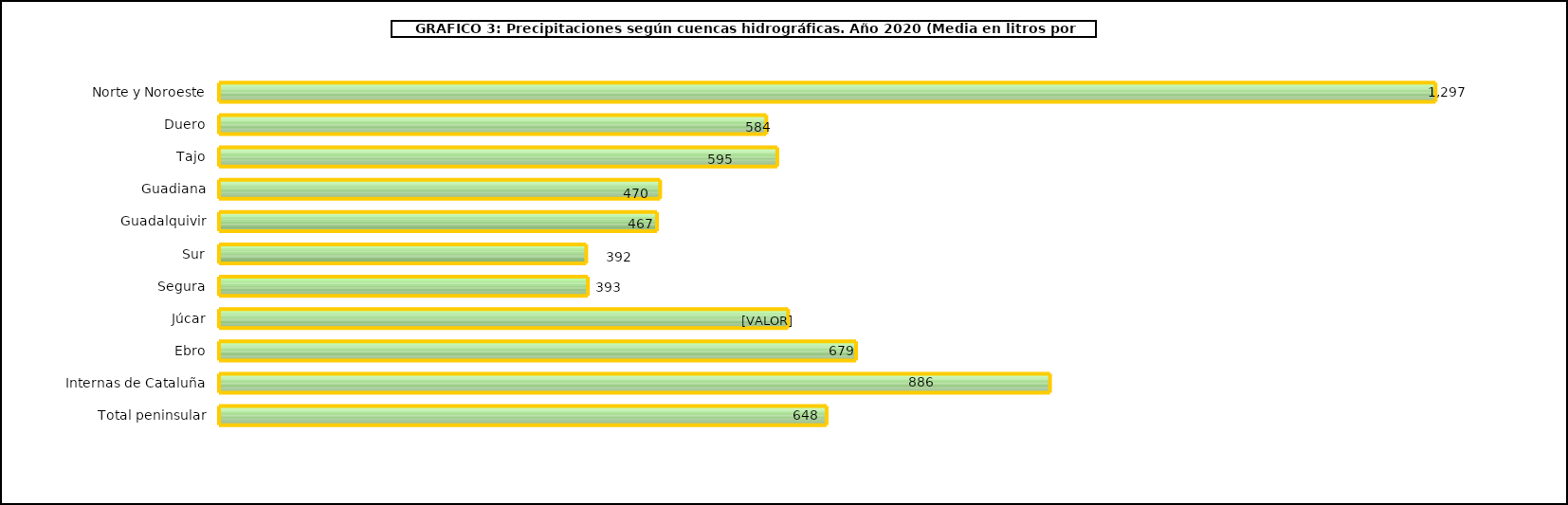
| Category | cuencas |
|---|---|
| 0 | 1297.2 |
| 1 | 583.6 |
| 2 | 595.3 |
| 3 | 470.4 |
| 4 | 467 |
| 5 | 391.6 |
| 6 | 393.3 |
| 7 | 606.9 |
| 8 | 679.3 |
| 9 | 886.1 |
| 10 | 647.9 |